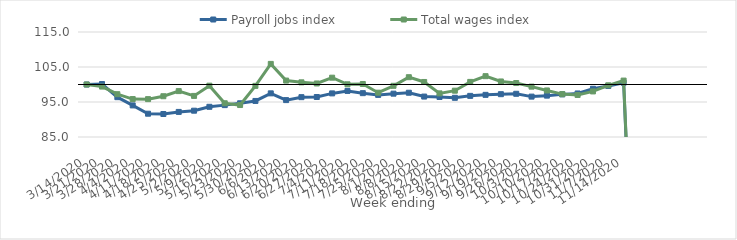
| Category | Payroll jobs index | Total wages index |
|---|---|---|
| 14/03/2020 | 100 | 100 |
| 21/03/2020 | 100.132 | 99.41 |
| 28/03/2020 | 96.375 | 97.232 |
| 04/04/2020 | 94.023 | 95.839 |
| 11/04/2020 | 91.654 | 95.821 |
| 18/04/2020 | 91.571 | 96.648 |
| 25/04/2020 | 92.167 | 98.112 |
| 02/05/2020 | 92.514 | 96.739 |
| 09/05/2020 | 93.628 | 99.664 |
| 16/05/2020 | 94.108 | 94.636 |
| 23/05/2020 | 94.637 | 94.13 |
| 30/05/2020 | 95.299 | 99.612 |
| 06/06/2020 | 97.47 | 105.884 |
| 13/06/2020 | 95.541 | 101.124 |
| 20/06/2020 | 96.384 | 100.62 |
| 27/06/2020 | 96.427 | 100.295 |
| 04/07/2020 | 97.458 | 101.948 |
| 11/07/2020 | 98.164 | 100.055 |
| 18/07/2020 | 97.526 | 100.143 |
| 25/07/2020 | 97.025 | 97.662 |
| 01/08/2020 | 97.382 | 99.626 |
| 08/08/2020 | 97.644 | 102.088 |
| 15/08/2020 | 96.553 | 100.721 |
| 22/08/2020 | 96.427 | 97.464 |
| 29/08/2020 | 96.199 | 98.234 |
| 05/09/2020 | 96.752 | 100.745 |
| 12/09/2020 | 97.044 | 102.38 |
| 19/09/2020 | 97.235 | 100.867 |
| 26/09/2020 | 97.346 | 100.422 |
| 03/10/2020 | 96.54 | 99.389 |
| 10/10/2020 | 96.82 | 98.3 |
| 17/10/2020 | 97.178 | 97.254 |
| 24/10/2020 | 97.44 | 97.009 |
| 31/10/2020 | 98.776 | 98.019 |
| 07/11/2020 | 99.583 | 99.764 |
| 14/11/2020 | 100.508 | 101.117 |